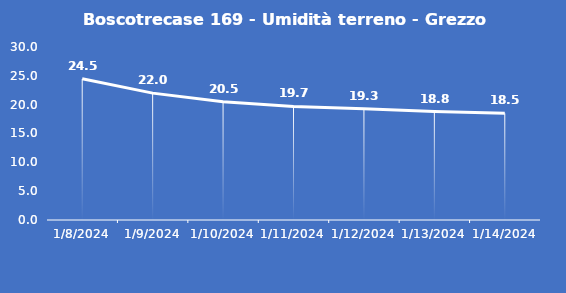
| Category | Boscotrecase 169 - Umidità terreno - Grezzo (%VWC) |
|---|---|
| 1/8/24 | 24.5 |
| 1/9/24 | 22 |
| 1/10/24 | 20.5 |
| 1/11/24 | 19.7 |
| 1/12/24 | 19.3 |
| 1/13/24 | 18.8 |
| 1/14/24 | 18.5 |